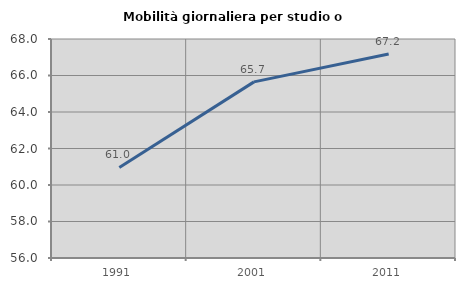
| Category | Mobilità giornaliera per studio o lavoro |
|---|---|
| 1991.0 | 60.963 |
| 2001.0 | 65.651 |
| 2011.0 | 67.183 |